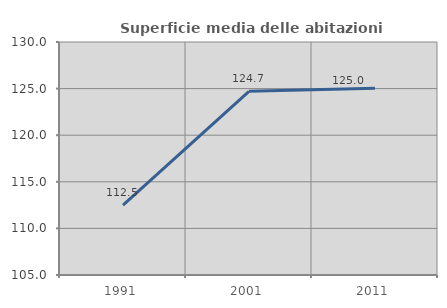
| Category | Superficie media delle abitazioni occupate |
|---|---|
| 1991.0 | 112.503 |
| 2001.0 | 124.709 |
| 2011.0 | 125.036 |